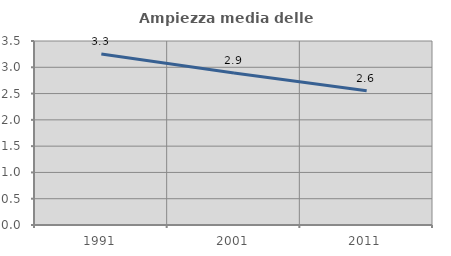
| Category | Ampiezza media delle famiglie |
|---|---|
| 1991.0 | 3.252 |
| 2001.0 | 2.89 |
| 2011.0 | 2.554 |